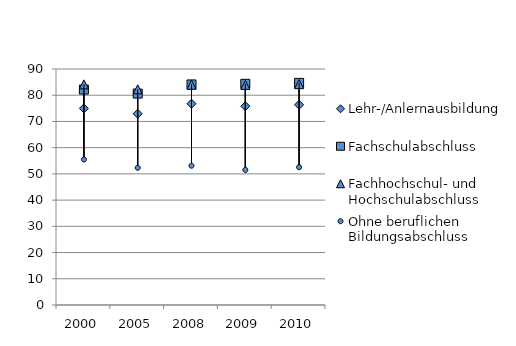
| Category | Lehr-/Anlernausbildung | Fachschulabschluss | Fachhochschul- und Hochschulabschluss | Ohne beruflichen Bildungsabschluss |
|---|---|---|---|---|
| 2000.0 | 74.986 | 82.159 | 84.134 | 55.505 |
| 2005.0 | 72.95 | 80.631 | 82.251 | 52.331 |
| 2008.0 | 76.756 | 84.112 | 84.006 | 53.128 |
| 2009.0 | 75.828 | 84.342 | 83.929 | 51.509 |
| 2010.0 | 76.35 | 84.709 | 84.224 | 52.567 |